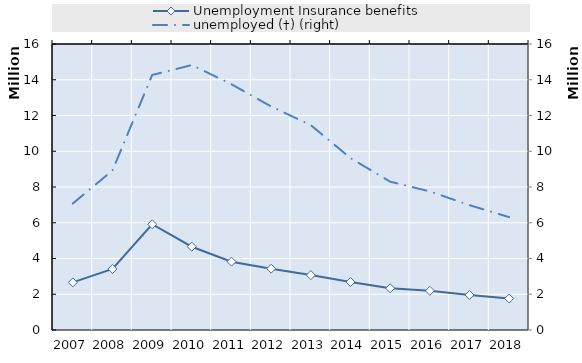
| Category | Unemployment Insurance benefits |
|---|---|
| 2007.0 | 2662016.923 |
| 2008.0 | 3415093.885 |
| 2009.0 | 5915911.885 |
| 2010.0 | 4658634.577 |
| 2011.0 | 3822596.519 |
| 2012.0 | 3429825.038 |
| 2013.0 | 3070866.173 |
| 2014.0 | 2685346.135 |
| 2015.0 | 2337058.577 |
| 2016.0 | 2192513.981 |
| 2017.0 | 1960465 |
| 2018.0 | 1760959 |